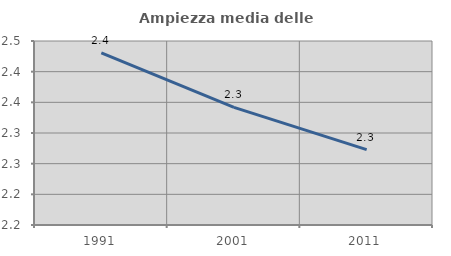
| Category | Ampiezza media delle famiglie |
|---|---|
| 1991.0 | 2.431 |
| 2001.0 | 2.342 |
| 2011.0 | 2.273 |